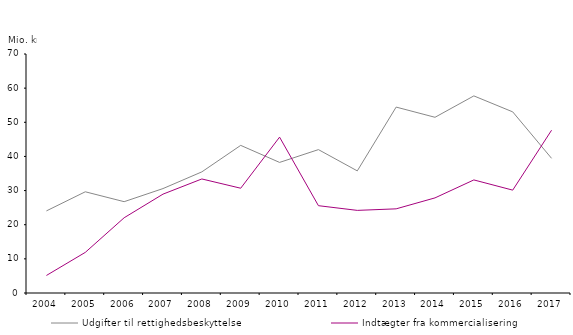
| Category | Udgifter til rettighedsbeskyttelse | Indtægter fra kommercialisering |
|---|---|---|
| 2004.0 | 24.048 | 5.138 |
| 2005.0 | 29.645 | 11.896 |
| 2006.0 | 26.747 | 22.037 |
| 2007.0 | 30.584 | 28.955 |
| 2008.0 | 35.48 | 33.401 |
| 2009.0 | 43.236 | 30.688 |
| 2010.0 | 38.248 | 45.651 |
| 2011.0 | 41.993 | 25.575 |
| 2012.0 | 35.765 | 24.197 |
| 2013.0 | 54.453 | 24.653 |
| 2014.0 | 51.465 | 27.86 |
| 2015.0 | 57.727 | 33.116 |
| 2016.0 | 53.053 | 30.13 |
| 2017.0 | 39.442 | 47.68 |